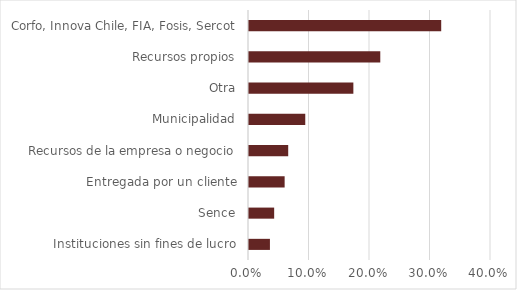
| Category | Series 0 |
|---|---|
| Instituciones sin fines de lucro | 0.035 |
| Sence | 0.042 |
| Entregada por un cliente | 0.059 |
| Recursos de la empresa o negocio | 0.065 |
| Municipalidad | 0.093 |
| Otra | 0.172 |
| Recursos propios | 0.217 |
| Corfo, Innova Chile, FIA, Fosis, Sercot | 0.318 |